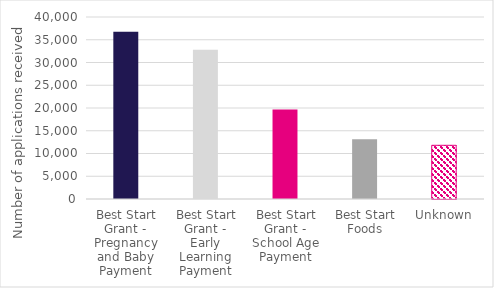
| Category | Series 0 |
|---|---|
| Best Start Grant - Pregnancy and Baby Payment | 36750 |
| Best Start Grant - Early Learning Payment | 32805 |
| Best Start Grant - School Age Payment | 19645 |
| Best Start Foods | 13115 |
| Unknown | 11800 |